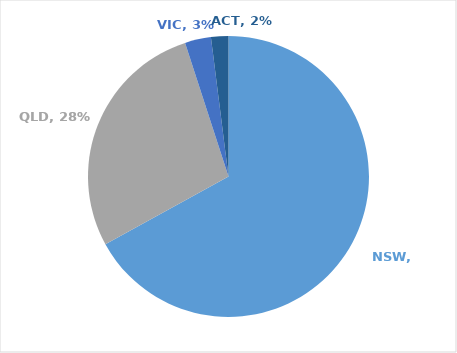
| Category | Series 0 |
|---|---|
| NSW | 0.67 |
| QLD | 0.28 |
| VIC | 0.03 |
| ACT | 0.02 |